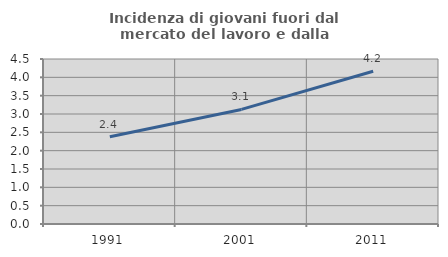
| Category | Incidenza di giovani fuori dal mercato del lavoro e dalla formazione  |
|---|---|
| 1991.0 | 2.381 |
| 2001.0 | 3.125 |
| 2011.0 | 4.167 |